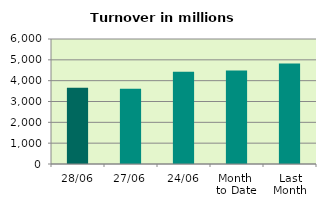
| Category | Series 0 |
|---|---|
| 28/06 | 3664.43 |
| 27/06 | 3610.412 |
| 24/06 | 4425.633 |
| Month 
to Date | 4491.138 |
| Last
Month | 4818.103 |